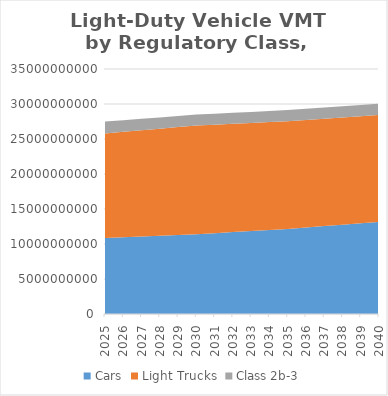
| Category | Cars | Light Trucks | Class 2b-3 |
|---|---|---|---|
| 2025.0 | 10845112841.656 | 14956514600.64 | 1687833046.308 |
| 2026.0 | 10956594563.355 | 15069954340.692 | 1662746975.846 |
| 2027.0 | 11068076285.054 | 15183394080.745 | 1637660905.385 |
| 2028.0 | 11179558006.752 | 15296833820.798 | 1612574834.923 |
| 2029.0 | 11291039728.451 | 15410273560.851 | 1587488764.462 |
| 2030.0 | 11402521450.15 | 15523713300.904 | 1562402694 |
| 2031.0 | 11553548510.622 | 15494322932.849 | 1569172533.716 |
| 2032.0 | 11704575571.094 | 15464932564.794 | 1575942373.433 |
| 2033.0 | 11855602631.565 | 15435542196.739 | 1582712213.149 |
| 2034.0 | 12006629692.037 | 15406151828.684 | 1589482052.866 |
| 2035.0 | 12157656752.509 | 15376761460.63 | 1596251892.582 |
| 2036.0 | 12359290591.889 | 15352378525.617 | 1603274857.666 |
| 2037.0 | 12560924431.27 | 15327995590.604 | 1610297822.749 |
| 2038.0 | 12762558270.65 | 15303612655.591 | 1617320787.833 |
| 2039.0 | 12964192110.03 | 15279229720.578 | 1624343752.916 |
| 2040.0 | 13165825949.41 | 15254846785.565 | 1631366718 |